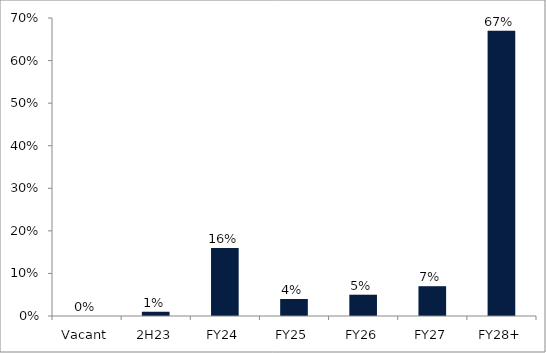
| Category | Series 0 |
|---|---|
| Vacant | 0 |
| 2H23 | 0.01 |
| FY24 | 0.16 |
| FY25 | 0.04 |
| FY26 | 0.05 |
| FY27 | 0.07 |
| FY28+ | 0.67 |